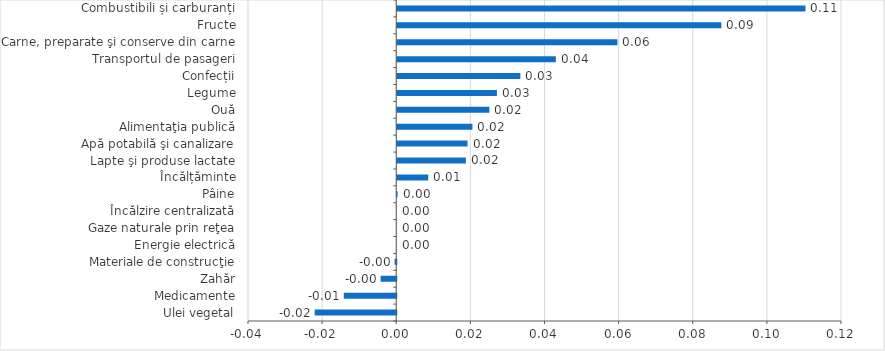
| Category | Series 0 |
|---|---|
| Ulei vegetal | -0.022 |
| Medicamente | -0.014 |
| Zahăr | -0.004 |
| Materiale de construcţie | 0 |
| Energie electrică | 0 |
| Gaze naturale prin reţea | 0 |
| Încălzire centralizată | 0 |
| Pâine | 0 |
| Încălțăminte | 0.008 |
| Lapte şi produse lactate | 0.019 |
| Apă potabilă şi canalizare | 0.019 |
| Alimentaţia publică | 0.02 |
| Ouă | 0.025 |
| Legume | 0.027 |
| Confecții | 0.033 |
| Transportul de pasageri | 0.043 |
| Carne, preparate şi conserve din carne | 0.059 |
| Fructe | 0.087 |
| Combustibili și carburanți | 0.11 |